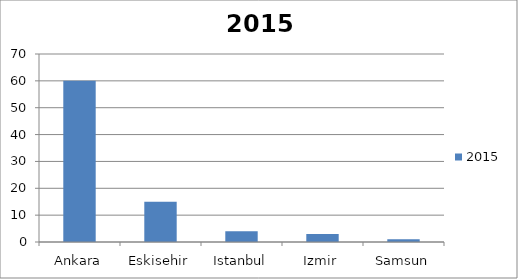
| Category | 2015 |
|---|---|
| Ankara | 60 |
| Eskisehir | 15 |
| Istanbul | 4 |
| Izmir | 3 |
| Samsun | 1 |